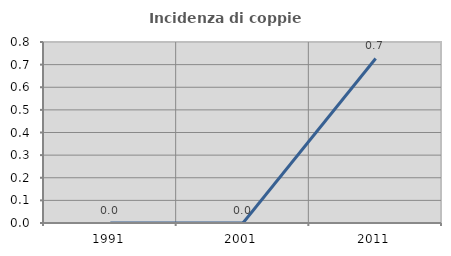
| Category | Incidenza di coppie miste |
|---|---|
| 1991.0 | 0 |
| 2001.0 | 0 |
| 2011.0 | 0.727 |